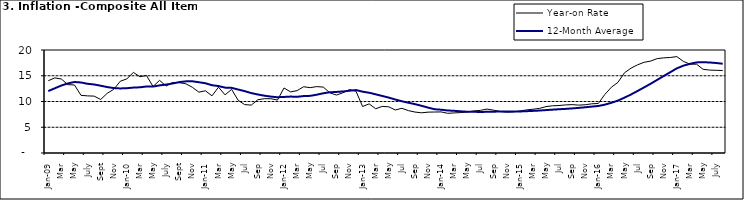
| Category | Year-on Rate | 12-Month Average |
|---|---|---|
| Jan-09 | 14.034 | 12.032 |
| Feb | 14.584 | 12.567 |
| Mar | 14.366 | 13.101 |
| Apr | 13.268 | 13.51 |
| May | 13.212 | 13.787 |
| June | 11.194 | 13.694 |
| July | 11.09 | 13.437 |
| Aug | 11.046 | 13.307 |
| Sept | 10.39 | 13.065 |
| Oct | 11.588 | 12.803 |
| Nov | 12.368 | 12.609 |
| Dec | 13.93 | 12.538 |
| Jan-10 | 14.398 | 12.586 |
| Feb | 15.649 | 12.7 |
| Mar | 14.812 | 12.757 |
| Apr | 15.044 | 12.915 |
| May | 12.915 | 12.893 |
| June | 14.099 | 13.132 |
| July | 13.002 | 13.284 |
| Aug | 13.702 | 13.5 |
| Sept | 13.65 | 13.764 |
| Oct | 13.45 | 13.908 |
| Nov | 12.766 | 13.928 |
| Dec | 11.815 | 13.74 |
| Jan-11 | 12.08 | 13.542 |
| Feb | 11.1 | 13.161 |
| Mar | 12.779 | 13.001 |
| Apr | 11.291 | 12.694 |
| May | 12.352 | 12.648 |
| Jun | 10.23 | 12.321 |
| Jul | 9.397 | 12.009 |
| Aug | 9.301 | 11.635 |
| Sep | 10.339 | 11.363 |
| Oct | 10.544 | 11.13 |
| Nov | 10.54 | 10.952 |
| Dec | 10.283 | 10.826 |
| Jan-12 | 12.626 | 10.886 |
| Feb | 11.866 | 10.955 |
| Mar | 12.111 | 10.914 |
| Apr | 12.866 | 11.054 |
| May | 12.688 | 11.096 |
| Jun | 12.892 | 11.32 |
| Jul | 12.797 | 11.599 |
| Aug | 11.689 | 11.791 |
| Sep | 11.253 | 11.859 |
| Oct | 11.693 | 11.948 |
| Nov | 12.32 | 12.091 |
| Dec | 11.981 | 12.224 |
| Jan-13 | 9.031 | 11.908 |
| Feb | 9.542 | 11.703 |
| Mar | 8.593 | 11.394 |
| Apr | 9.052 | 11.072 |
| May | 8.964 | 10.761 |
| Jun | 8.353 | 10.383 |
| Jul | 8.682 | 10.047 |
| Aug | 8.231 | 9.761 |
| Sep | 7.952 | 9.486 |
| Oct | 7.807 | 9.167 |
| Nov | 7.931 | 8.815 |
| Dec | 7.957 | 8.496 |
| Jan-14 | 7.977 | 8.408 |
| Feb | 7.707 | 8.257 |
| Mar | 7.783 | 8.19 |
| Apr | 7.851 | 8.092 |
| May | 7.965 | 8.012 |
| Jun | 8.167 | 7.998 |
| Jul | 8.281 | 7.968 |
| Aug | 8.534 | 7.996 |
| Sep | 8.317 | 8.027 |
| Oct | 8.06 | 8.047 |
| Nov | 7.927 | 8.046 |
| Dec | 7.978 | 8.047 |
| Jan-15 | 8.157 | 8.063 |
| Feb | 8.359 | 8.117 |
| Mar | 8.494 | 8.176 |
| Apr | 8.655 | 8.243 |
| May | 9.003 | 8.331 |
| Jun | 9.168 | 8.417 |
| Jul | 9.218 | 8.497 |
| Aug | 9.336 | 8.566 |
| Sep | 9.394 | 8.658 |
| Oct | 9.296 | 8.76 |
| Nov | 9.368 | 8.879 |
| Dec | 9.554 | 9.009 |
| Jan-16 | 9.617 | 9.13 |
| Feb | 11.379 | 9.386 |
| Mar | 12.775 | 9.751 |
| Apr | 13.721 | 10.182 |
| May | 15.577 | 10.746 |
| Jun | 16.48 | 11.372 |
| Jul | 17.127 | 12.045 |
| Aug | 17.609 | 12.744 |
| Sep | 17.852 | 13.454 |
| Oct | 18.33 | 14.206 |
| Nov | 18.476 | 14.958 |
| Dec | 18.547 | 15.697 |
| Jan-17 | 18.719 | 16.441 |
| Feb | 17.78 | 16.958 |
| Mar | 17.256 | 17.315 |
| Apr | 17.244 | 17.591 |
| May | 16.251 | 17.628 |
| June | 16.098 | 17.578 |
| July | 16.053 | 17.475 |
| August | 16.012 | 17.331 |